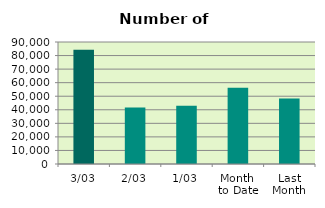
| Category | Series 0 |
|---|---|
| 3/03 | 84198 |
| 2/03 | 41610 |
| 1/03 | 42896 |
| Month 
to Date | 56234.667 |
| Last
Month | 48363.3 |